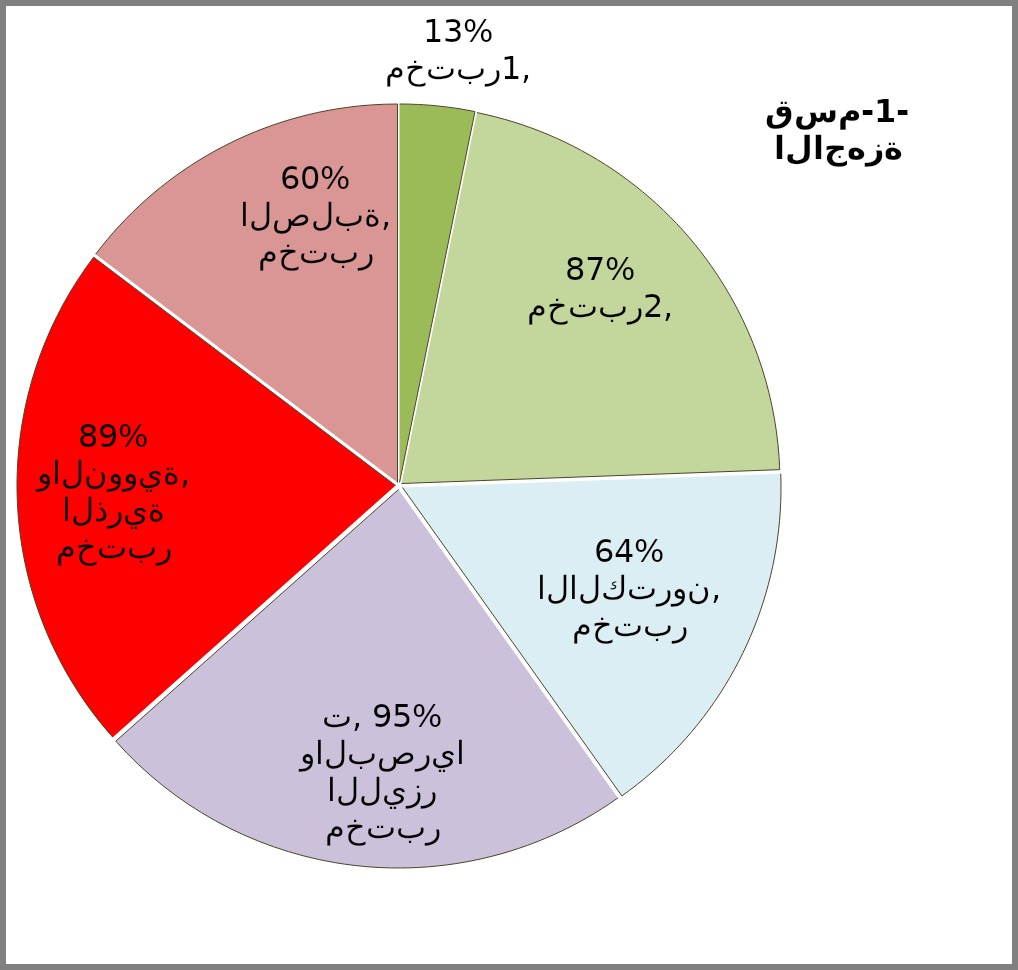
| Category | Series 2 | Series 3 | Series 1 | Series 0 |
|---|---|---|---|---|
| مختبر1 | 0.13 | 0.783 | 1 | 0.783 |
| مختبر2 | 0.867 | 0.867 | 0.545 | 0.867 |
| مختبر الالكترون | 0.643 | 0.914 | 0.909 | 0.914 |
| مختبر الليزر والبصريات | 0.95 | 0.8 | 0.818 | 0.8 |
| مختبر الذرية والنووية | 0.894 | 0.872 | 0.727 | 0.872 |
| مختبر الصلبة | 0.6 | 0.6 | 0.455 | 0.6 |